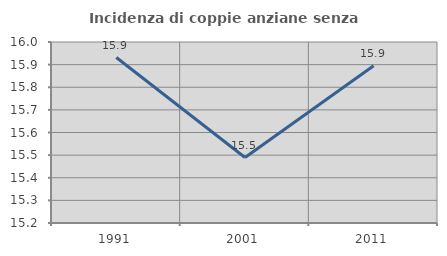
| Category | Incidenza di coppie anziane senza figli  |
|---|---|
| 1991.0 | 15.931 |
| 2001.0 | 15.489 |
| 2011.0 | 15.895 |